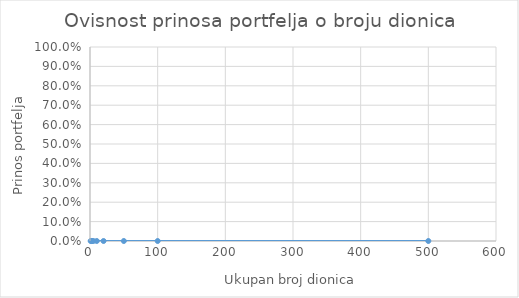
| Category | prinos portfelja |
|---|---|
| 1.0 | 0 |
| 2.0 | 0 |
| 3.0 | 0 |
| 5.0 | 0 |
| 10.0 | 0 |
| 20.0 | 0 |
| 50.0 | 0 |
| 100.0 | 0 |
| 500.0 | 0 |